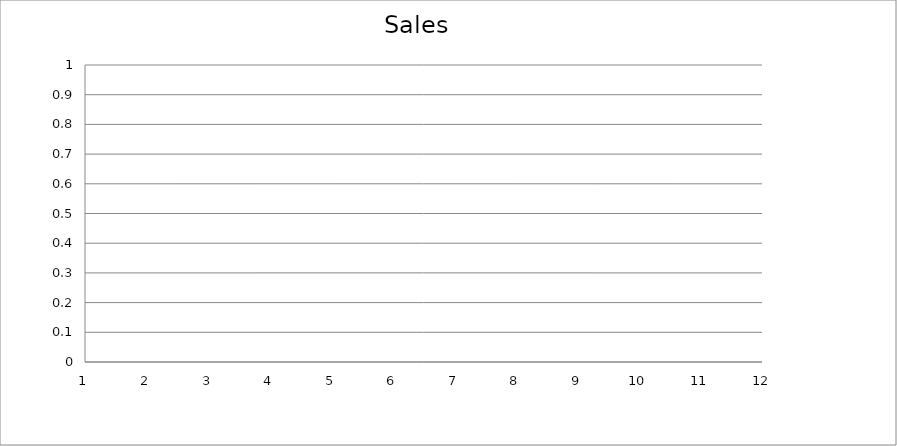
| Category | Actual |
|---|---|
| 0 | 540 |
| 1 | 2520 |
| 2 | 740 |
| 3 | 530 |
| 4 | 1710 |
| 5 | 2140 |
| 6 | 3220 |
| 7 | 1330 |
| 8 | 570 |
| 9 | 1940 |
| 10 | 1300 |
| 11 | 2870 |